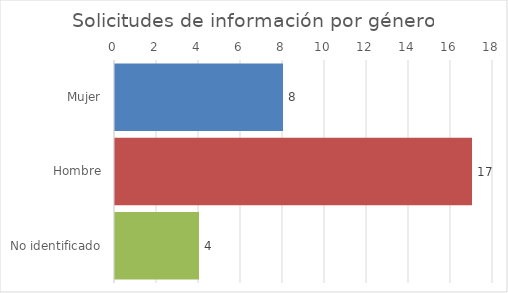
| Category | Series 0 |
|---|---|
| Mujer | 8 |
| Hombre | 17 |
| No identificado | 4 |